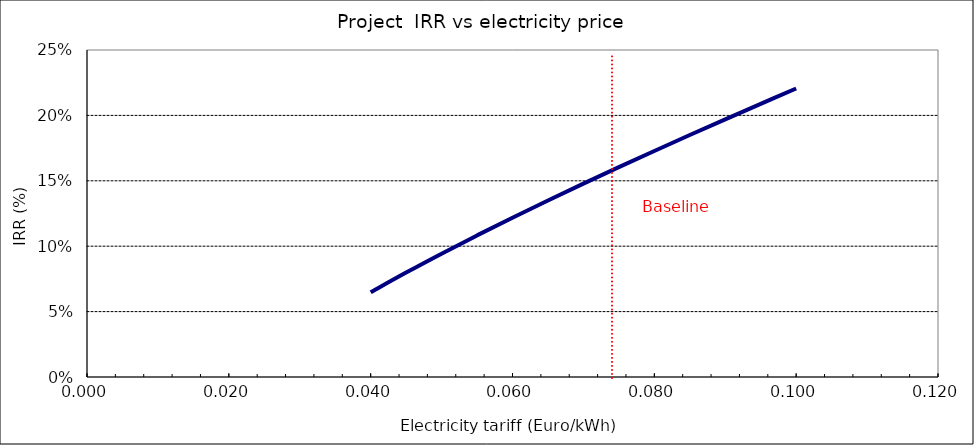
| Category | Series 0 |
|---|---|
| 0.039999999999999966 | 0.065 |
| 0.044999999999999964 | 0.08 |
| 0.04999999999999996 | 0.094 |
| 0.054999999999999966 | 0.108 |
| 0.05999999999999997 | 0.122 |
| 0.06499999999999997 | 0.135 |
| 0.06999999999999998 | 0.148 |
| 0.07499999999999998 | 0.16 |
| 0.07999999999999999 | 0.173 |
| 0.08499999999999999 | 0.185 |
| 0.09 | 0.197 |
| 0.095 | 0.209 |
| 0.1 | 0.221 |